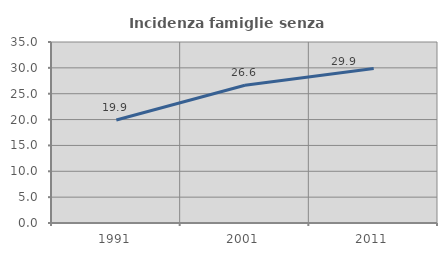
| Category | Incidenza famiglie senza nuclei |
|---|---|
| 1991.0 | 19.92 |
| 2001.0 | 26.625 |
| 2011.0 | 29.856 |